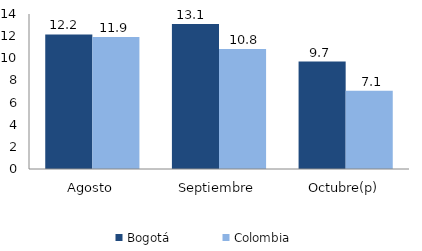
| Category | Bogotá | Colombia |
|---|---|---|
| Agosto | 12.152 | 11.917 |
| Septiembre | 13.086 | 10.843 |
| Octubre(p) | 9.699 | 7.068 |